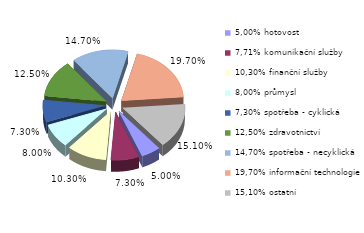
| Category | Series 0 |
|---|---|
| 5,00% hotovost | 0.05 |
| 7,71% komunikační služby | 0.073 |
| 10,30% finanční služby | 0.103 |
| 8,00% průmysl | 0.08 |
| 7,30% spotřeba - cyklická | 0.073 |
| 12,50% zdravotnictví | 0.125 |
| 14,70% spotřeba - necyklická | 0.147 |
| 19,70% informační technologie | 0.197 |
| 15,10% ostatní | 0.151 |